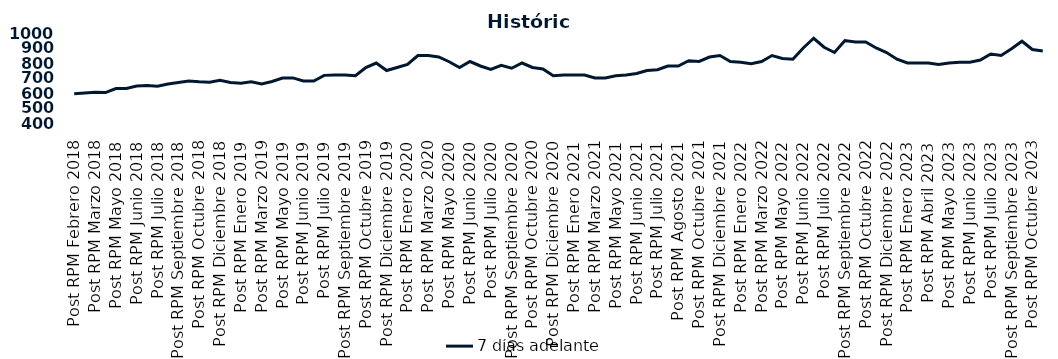
| Category | 7 días adelante  |
|---|---|
| Post RPM Febrero 2018 | 595 |
| Pre RPM Marzo 2018 | 600 |
| Post RPM Marzo 2018 | 605 |
| Pre RPM Mayo 2018 | 603 |
| Post RPM Mayo 2018 | 630 |
| Pre RPM Junio 2018 | 630 |
| Post RPM Junio 2018 | 646.5 |
| Pre RPM Julio 2018 | 650 |
| Post RPM Julio 2018 | 645 |
| Pre RPM Septiembre 2018 | 660 |
| Post RPM Septiembre 2018 | 670 |
| Pre RPM Octubre 2018 | 680 |
| Post RPM Octubre 2018 | 675 |
| Pre RPM Diciembre 2018 | 672.5 |
| Post RPM Diciembre 2018 | 685 |
| Pre RPM Enero 2019 | 670 |
| Post RPM Enero 2019 | 665 |
| Pre RPM Marzo 2019 | 675 |
| Post RPM Marzo 2019 | 661 |
| Pre RPM Mayo 2019 | 677 |
| Post RPM Mayo 2019 | 700 |
| Pre RPM Junio 2019 | 700.5 |
| Post RPM Junio 2019 | 680 |
| Pre RPM Julio 2019 | 680 |
| Post RPM Julio 2019 | 717.5 |
| Pre RPM Septiembre 2019 | 720 |
| Post RPM Septiembre 2019 | 720 |
| Pre RPM Octubre 2019 | 715 |
| Post RPM Octubre 2019 | 770 |
| Pre RPM Diciembre 2019 | 800 |
| Post RPM Diciembre 2019 | 750 |
| Pre RPM Enero 2020 | 770 |
| Post RPM Enero 2020 | 790 |
| Pre RPM Marzo 2020 | 850 |
| Post RPM Marzo 2020 | 850 |
| Pre RPM Mayo 2020 | 840 |
| Post RPM Mayo 2020 | 808.5 |
| Pre RPM Junio 2020 | 770 |
| Post RPM Junio 2020 | 810 |
| Pre RPM Julio 2020 | 780 |
| Post RPM Julio 2020 | 757 |
| Pre RPM Septiembre 2020 | 785 |
| Post RPM Septiembre 2020 | 765 |
| Pre RPM Octubre 2020 | 800 |
| Post RPM Octubre 2020 | 770 |
| Pre RPM Diciembre 2020 | 760 |
| Post RPM Diciembre 2020 | 715 |
| Pre RPM Enero 2021 | 720 |
| Post RPM Enero 2021 | 720 |
| Pre RPM Marzo 2021 | 720 |
| Post RPM Marzo 2021 | 700 |
| Pre RPM Mayo 2021 | 700 |
| Post RPM Mayo 2021 | 715 |
| Pre RPM Junio 2021 | 720 |
| Post RPM Junio 2021 | 730 |
| Pre RPM Julio 2021 | 750 |
| Post RPM Julio 2021 | 755 |
| Pre RPM Agosto 2021 | 780 |
| Post RPM Agosto 2021 | 780 |
| Pre RPM Octubre 2021 | 815 |
| Post RPM Octubre 2021 | 810 |
| Pre RPM Diciembre 2021 | 840 |
| Post RPM Diciembre 2021 | 850 |
| Pre RPM Enero 2022 | 810 |
| Post RPM Enero 2022 | 805 |
| Pre RPM Marzo 2022 | 795 |
| Post RPM Marzo 2022 | 810 |
| Pre RPM Mayo 2022 | 850 |
| Post RPM Mayo 2022 | 830 |
| Pre RPM Junio 2022 | 825 |
| Post RPM Junio 2022 | 900 |
| Pre RPM Julio 2022 | 965 |
| Post RPM Julio 2022 | 905 |
| Pre RPM Septiembre 2022 | 870 |
| Post RPM Septiembre 2022 | 950 |
| Pre RPM Octubre 2022 | 940 |
| Post RPM Octubre 2022 | 940 |
| Pre RPM Diciembre 2022 | 900 |
| Post RPM Diciembre 2022 | 870 |
| Pre RPM Enero 2023 | 825 |
| Post RPM Enero 2023 | 800 |
| Pre RPM Abril 2023 | 800 |
| Post RPM Abril 2023 | 800 |
| Pre RPM Mayo 2023 | 790 |
| Post RPM Mayo 2023 | 800 |
| Pre RPM Junio 2023 | 805 |
| Post RPM Junio 2023 | 805 |
| Pre RPM Julio 2023 | 820 |
| Post RPM Julio 2023 | 860 |
| Pre RPM Septiembre 2023 | 850 |
| Post RPM Septiembre 2023 | 895 |
| Pre RPM Octubre 2023 | 945 |
| Post RPM Octubre 2023 | 890 |
| Pre RPM Diciembre 2023 | 880 |